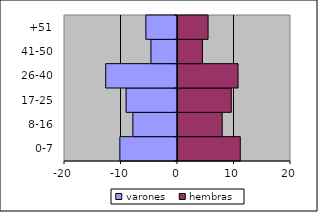
| Category | varones | hembras |
|---|---|---|
| 0-7 | -10.2 | 11.2 |
| 8-16 | -7.9 | 8 |
| 17-25 | -9.1 | 9.6 |
| 26-40 | -12.7 | 10.8 |
| 41-50 | -4.7 | 4.5 |
| +51 | -5.6 | 5.5 |